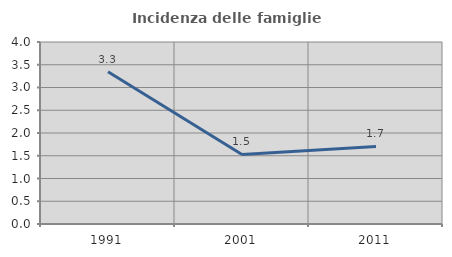
| Category | Incidenza delle famiglie numerose |
|---|---|
| 1991.0 | 3.346 |
| 2001.0 | 1.529 |
| 2011.0 | 1.704 |